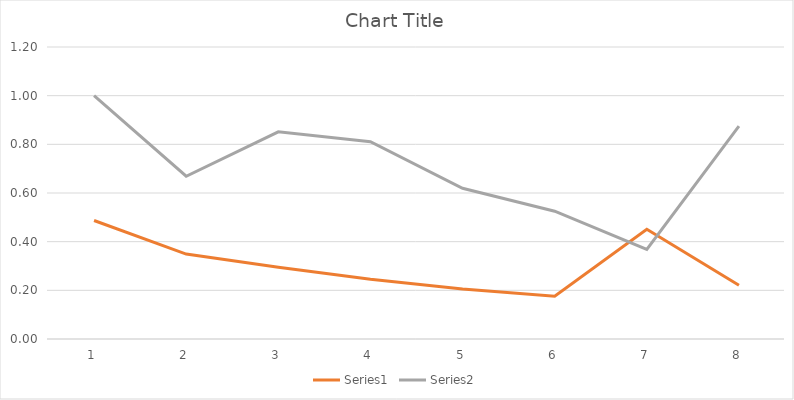
| Category | Series 1 | Series 2 |
|---|---|---|
| 0 | 0.487 | 1 |
| 1 | 0.349 | 0.669 |
| 2 | 0.295 | 0.851 |
| 3 | 0.246 | 0.811 |
| 4 | 0.205 | 0.619 |
| 5 | 0.176 | 0.525 |
| 6 | 0.451 | 0.368 |
| 7 | 0.221 | 0.875 |